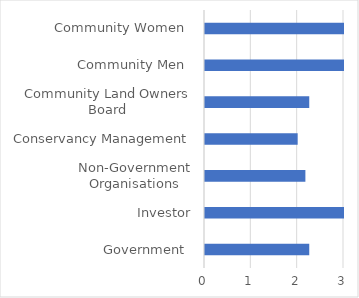
| Category | Respect for actors |
|---|---|
| Government  | 2.25 |
| Investor | 3 |
| Non-Government Organisations | 2.167 |
| Conservancy Management | 2 |
| Community Land Owners Board | 2.25 |
| Community Men  | 3 |
| Community Women  | 3 |